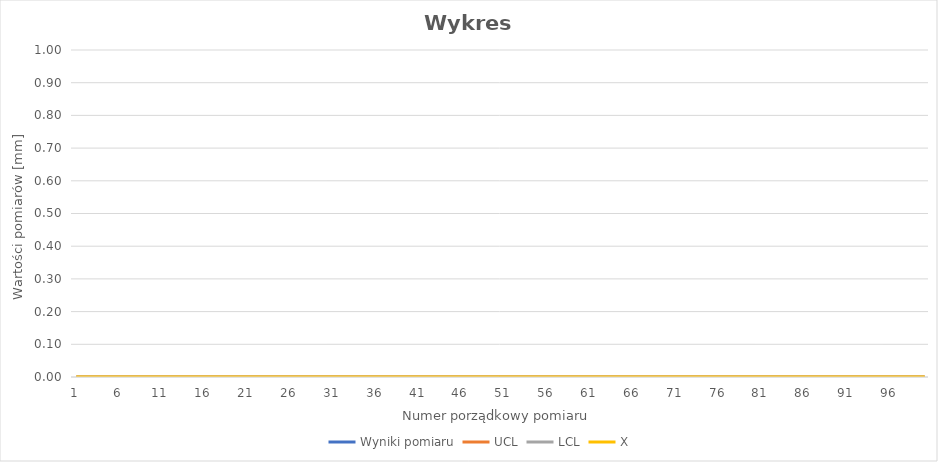
| Category | Wyniki pomiaru | UCL | LCL | X |
|---|---|---|---|---|
| 0 |  | 0 | 0 | 0 |
| 1 |  | 0 | 0 | 0 |
| 2 |  | 0 | 0 | 0 |
| 3 |  | 0 | 0 | 0 |
| 4 |  | 0 | 0 | 0 |
| 5 |  | 0 | 0 | 0 |
| 6 |  | 0 | 0 | 0 |
| 7 |  | 0 | 0 | 0 |
| 8 |  | 0 | 0 | 0 |
| 9 |  | 0 | 0 | 0 |
| 10 |  | 0 | 0 | 0 |
| 11 |  | 0 | 0 | 0 |
| 12 |  | 0 | 0 | 0 |
| 13 |  | 0 | 0 | 0 |
| 14 |  | 0 | 0 | 0 |
| 15 |  | 0 | 0 | 0 |
| 16 |  | 0 | 0 | 0 |
| 17 |  | 0 | 0 | 0 |
| 18 |  | 0 | 0 | 0 |
| 19 |  | 0 | 0 | 0 |
| 20 |  | 0 | 0 | 0 |
| 21 |  | 0 | 0 | 0 |
| 22 |  | 0 | 0 | 0 |
| 23 |  | 0 | 0 | 0 |
| 24 |  | 0 | 0 | 0 |
| 25 |  | 0 | 0 | 0 |
| 26 |  | 0 | 0 | 0 |
| 27 |  | 0 | 0 | 0 |
| 28 |  | 0 | 0 | 0 |
| 29 |  | 0 | 0 | 0 |
| 30 |  | 0 | 0 | 0 |
| 31 |  | 0 | 0 | 0 |
| 32 |  | 0 | 0 | 0 |
| 33 |  | 0 | 0 | 0 |
| 34 |  | 0 | 0 | 0 |
| 35 |  | 0 | 0 | 0 |
| 36 |  | 0 | 0 | 0 |
| 37 |  | 0 | 0 | 0 |
| 38 |  | 0 | 0 | 0 |
| 39 |  | 0 | 0 | 0 |
| 40 |  | 0 | 0 | 0 |
| 41 |  | 0 | 0 | 0 |
| 42 |  | 0 | 0 | 0 |
| 43 |  | 0 | 0 | 0 |
| 44 |  | 0 | 0 | 0 |
| 45 |  | 0 | 0 | 0 |
| 46 |  | 0 | 0 | 0 |
| 47 |  | 0 | 0 | 0 |
| 48 |  | 0 | 0 | 0 |
| 49 |  | 0 | 0 | 0 |
| 50 |  | 0 | 0 | 0 |
| 51 |  | 0 | 0 | 0 |
| 52 |  | 0 | 0 | 0 |
| 53 |  | 0 | 0 | 0 |
| 54 |  | 0 | 0 | 0 |
| 55 |  | 0 | 0 | 0 |
| 56 |  | 0 | 0 | 0 |
| 57 |  | 0 | 0 | 0 |
| 58 |  | 0 | 0 | 0 |
| 59 |  | 0 | 0 | 0 |
| 60 |  | 0 | 0 | 0 |
| 61 |  | 0 | 0 | 0 |
| 62 |  | 0 | 0 | 0 |
| 63 |  | 0 | 0 | 0 |
| 64 |  | 0 | 0 | 0 |
| 65 |  | 0 | 0 | 0 |
| 66 |  | 0 | 0 | 0 |
| 67 |  | 0 | 0 | 0 |
| 68 |  | 0 | 0 | 0 |
| 69 |  | 0 | 0 | 0 |
| 70 |  | 0 | 0 | 0 |
| 71 |  | 0 | 0 | 0 |
| 72 |  | 0 | 0 | 0 |
| 73 |  | 0 | 0 | 0 |
| 74 |  | 0 | 0 | 0 |
| 75 |  | 0 | 0 | 0 |
| 76 |  | 0 | 0 | 0 |
| 77 |  | 0 | 0 | 0 |
| 78 |  | 0 | 0 | 0 |
| 79 |  | 0 | 0 | 0 |
| 80 |  | 0 | 0 | 0 |
| 81 |  | 0 | 0 | 0 |
| 82 |  | 0 | 0 | 0 |
| 83 |  | 0 | 0 | 0 |
| 84 |  | 0 | 0 | 0 |
| 85 |  | 0 | 0 | 0 |
| 86 |  | 0 | 0 | 0 |
| 87 |  | 0 | 0 | 0 |
| 88 |  | 0 | 0 | 0 |
| 89 |  | 0 | 0 | 0 |
| 90 |  | 0 | 0 | 0 |
| 91 |  | 0 | 0 | 0 |
| 92 |  | 0 | 0 | 0 |
| 93 |  | 0 | 0 | 0 |
| 94 |  | 0 | 0 | 0 |
| 95 |  | 0 | 0 | 0 |
| 96 |  | 0 | 0 | 0 |
| 97 |  | 0 | 0 | 0 |
| 98 |  | 0 | 0 | 0 |
| 99 |  | 0 | 0 | 0 |